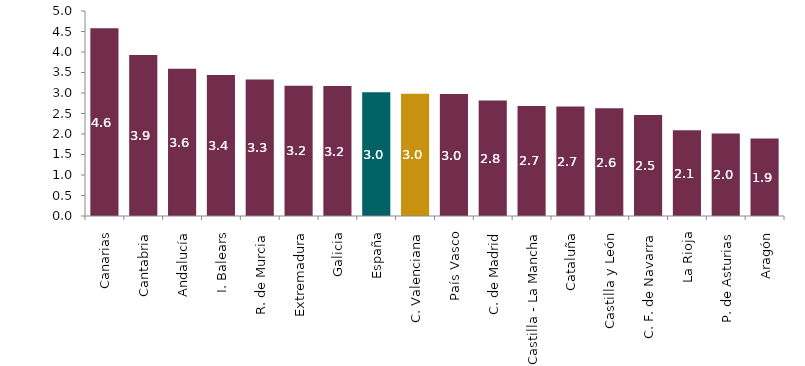
| Category | Índice de cifra de negocios al por menor |
|---|---|
| Canarias | 4.582 |
| Cantabria | 3.924 |
| Andalucía | 3.594 |
| I. Balears | 3.44 |
| R. de Murcia | 3.329 |
| Extremadura | 3.177 |
| Galicia | 3.17 |
| España | 3.016 |
| C. Valenciana | 2.979 |
| País Vasco | 2.975 |
| C. de Madrid | 2.818 |
| Castilla - La Mancha | 2.683 |
| Cataluña | 2.67 |
| Castilla y León | 2.627 |
| C. F. de Navarra | 2.463 |
| La Rioja | 2.094 |
| P. de Asturias | 2.01 |
| Aragón | 1.887 |